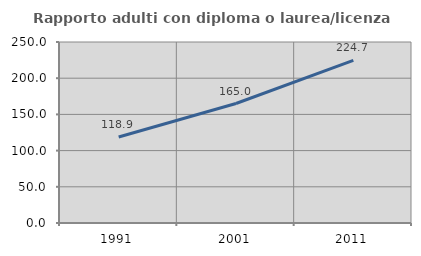
| Category | Rapporto adulti con diploma o laurea/licenza media  |
|---|---|
| 1991.0 | 118.866 |
| 2001.0 | 165.045 |
| 2011.0 | 224.691 |